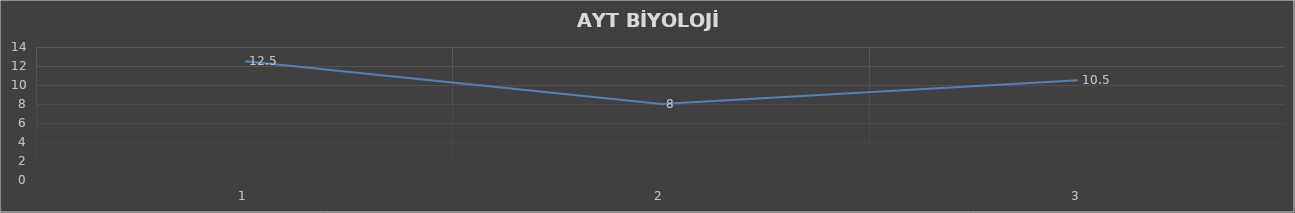
| Category | Series 0 |
|---|---|
| 0 | 12.5 |
| 1 | 8 |
| 2 | 10.5 |